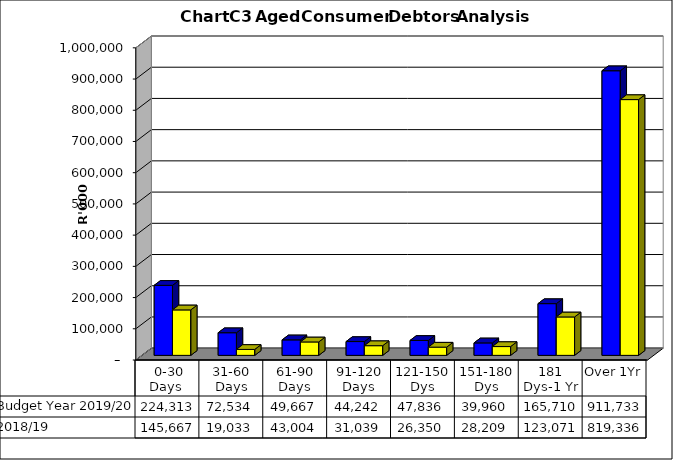
| Category | Budget Year 2019/20 | 2018/19 |
|---|---|---|
|  0-30 Days  | 224313369 | 145667460 |
| 31-60 Days | 72533590 | 19033220 |
| 61-90 Days | 49667034 | 43004421 |
| 91-120 Days | 44241546 | 31038730 |
| 121-150 Dys | 47836107 | 26349847 |
| 151-180 Dys | 39960226 | 28208855 |
| 181 Dys-1 Yr | 165710136 | 123071133 |
| Over 1Yr | 911733168 | 819335746 |